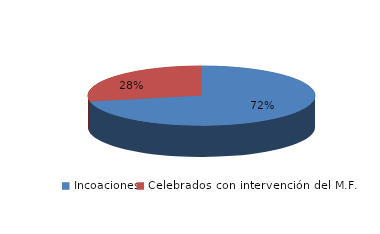
| Category | Series 0 |
|---|---|
| Incoaciones | 1129 |
| Celebrados con intervención del M.F. | 442 |